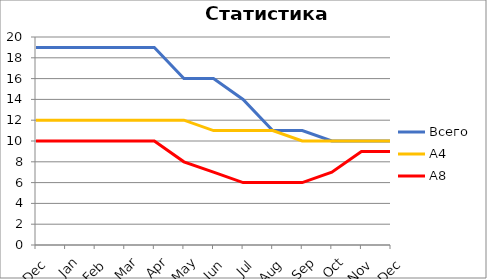
| Category | Всего | А4 | A8 |
|---|---|---|---|
| 0 | 19 | 12 | 10 |
| 1 | 19 | 12 | 10 |
| 2 | 19 | 12 | 10 |
| 3 | 19 | 12 | 10 |
| 4 | 19 | 12 | 10 |
| 5 | 16 | 12 | 8 |
| 6 | 16 | 11 | 7 |
| 7 | 14 | 11 | 6 |
| 8 | 11 | 11 | 6 |
| 9 | 11 | 10 | 6 |
| 10 | 10 | 10 | 7 |
| 11 | 10 | 10 | 9 |
| 12 | 10 | 10 | 9 |